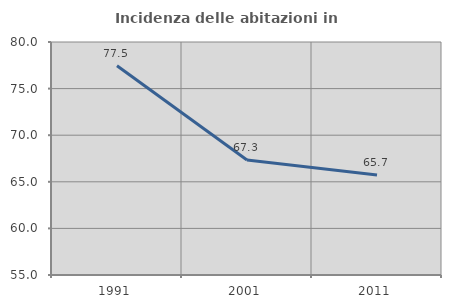
| Category | Incidenza delle abitazioni in proprietà  |
|---|---|
| 1991.0 | 77.451 |
| 2001.0 | 67.347 |
| 2011.0 | 65.741 |